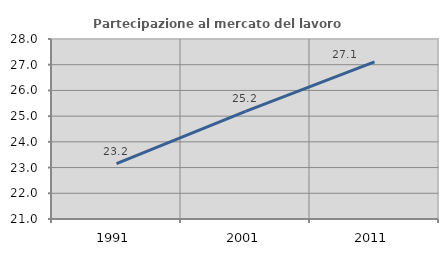
| Category | Partecipazione al mercato del lavoro  femminile |
|---|---|
| 1991.0 | 23.154 |
| 2001.0 | 25.188 |
| 2011.0 | 27.109 |